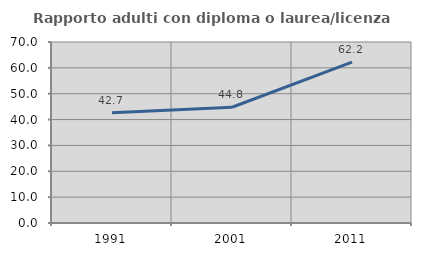
| Category | Rapporto adulti con diploma o laurea/licenza media  |
|---|---|
| 1991.0 | 42.67 |
| 2001.0 | 44.762 |
| 2011.0 | 62.222 |